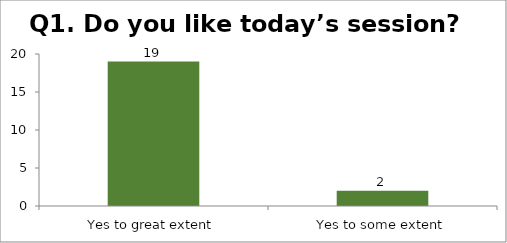
| Category | Q1. Do you like today’s session? |
|---|---|
| Yes to great extent | 19 |
| Yes to some extent | 2 |